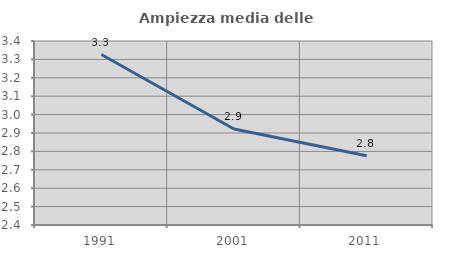
| Category | Ampiezza media delle famiglie |
|---|---|
| 1991.0 | 3.326 |
| 2001.0 | 2.922 |
| 2011.0 | 2.776 |